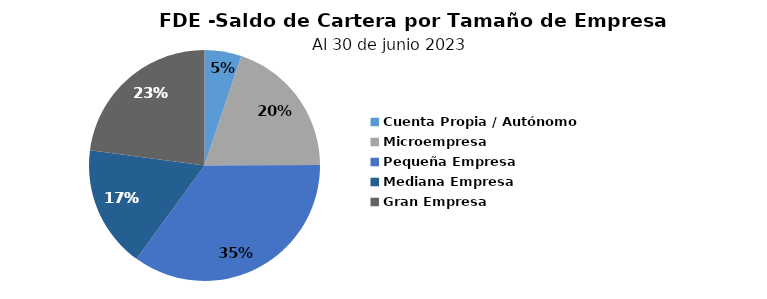
| Category | Saldo |
|---|---|
| Cuenta Propia / Autónomo | 2.632 |
| Microempresa | 10.045 |
| Pequeña Empresa | 17.855 |
| Mediana Empresa | 8.695 |
| Gran Empresa | 11.644 |